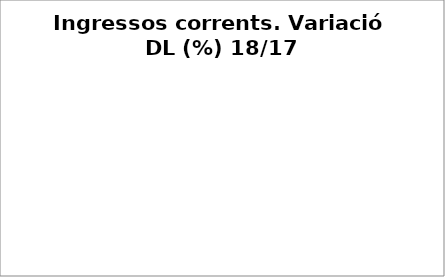
| Category | Series 0 |
|---|---|
| Impostos locals | -0.109 |
| Participació Tributs de l'Estat | 0.006 |
| Taxes i altres ingressos | -0.022 |
| Transferències corrents (exc. FCF) | 0.563 |
| Ingressos patrimonials | -0.271 |
| Ingressos corrents | -0.034 |